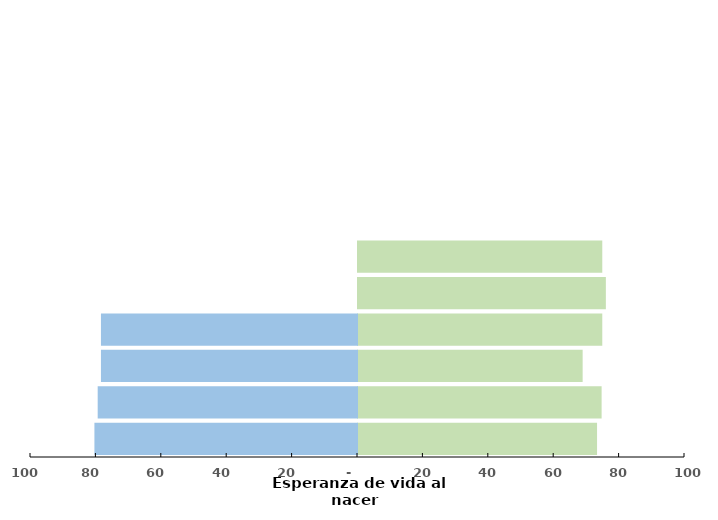
| Category | Series 0 | Series 1 |
|---|---|---|
| California  | 73.1 | -80.3 |
| Arizona  | 74.5 | -79.3 |
| Nuevo México  | 68.7 | -78.3 |
| Texas | 74.7 | -78.3 |